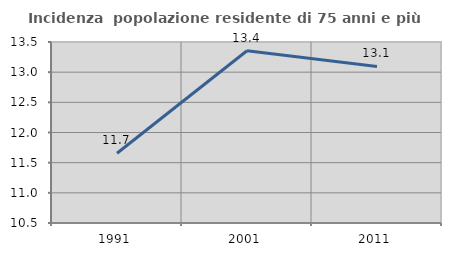
| Category | Incidenza  popolazione residente di 75 anni e più |
|---|---|
| 1991.0 | 11.656 |
| 2001.0 | 13.355 |
| 2011.0 | 13.095 |